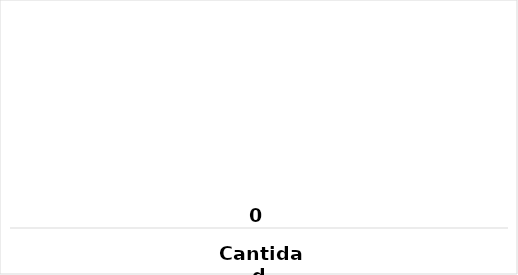
| Category |  -  |
|---|---|
| Cantidad | 0 |